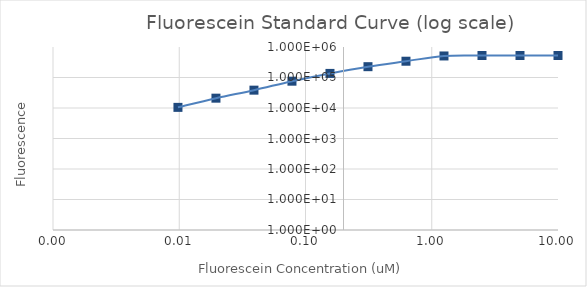
| Category | Series 1 |
|---|---|
| 10.0 | 527310.25 |
| 5.0 | 526498.75 |
| 2.5 | 526335.75 |
| 1.25 | 508300.25 |
| 0.625 | 341835.5 |
| 0.3125 | 226335 |
| 0.15625 | 136146 |
| 0.078125 | 75728 |
| 0.0390625 | 38468.5 |
| 0.01953125 | 20996.75 |
| 0.009765625 | 10487.5 |